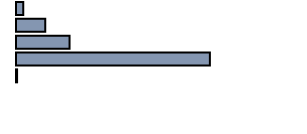
| Category | Series 0 |
|---|---|
| 0 | 2.576 |
| 1 | 10.227 |
| 2 | 18.788 |
| 3 | 68.03 |
| 4 | 0.379 |
| 5 | 0 |
| 6 | 0 |